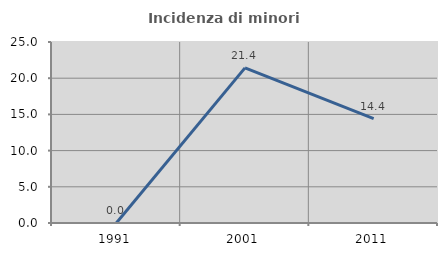
| Category | Incidenza di minori stranieri |
|---|---|
| 1991.0 | 0 |
| 2001.0 | 21.429 |
| 2011.0 | 14.423 |